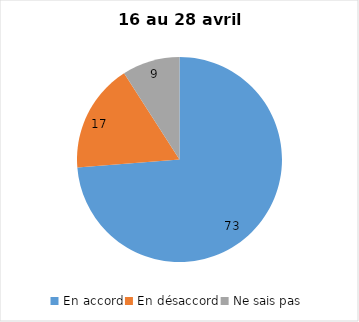
| Category | Series 0 |
|---|---|
| En accord | 73 |
| En désaccord | 17 |
| Ne sais pas | 9 |